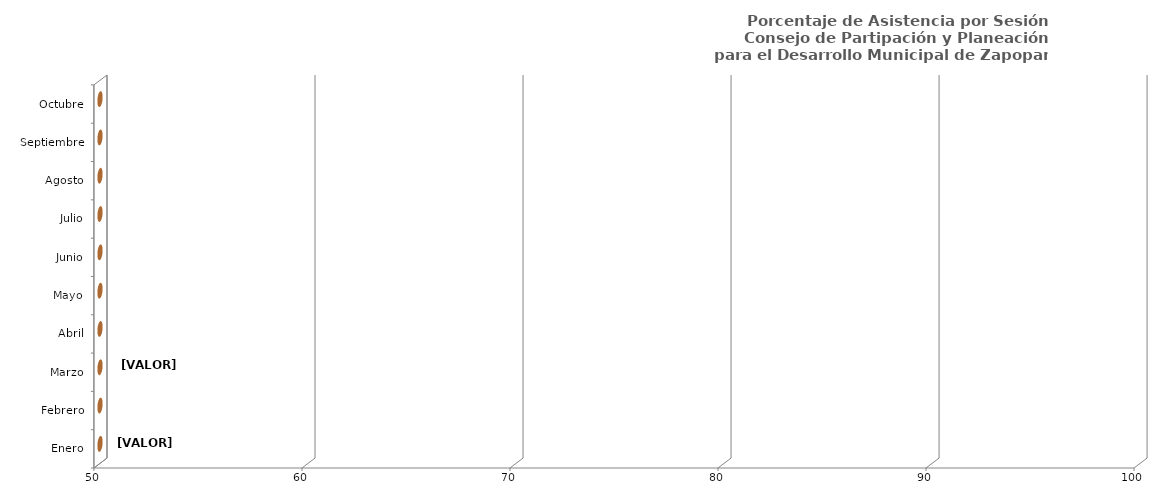
| Category | Series 0 |
|---|---|
| Enero | 0 |
| Febrero | 0 |
| Marzo | 0 |
| Abril | 0 |
| Mayo | 0 |
| Junio | 0 |
| Julio | 0 |
| Agosto | 0 |
| Septiembre | 0 |
| Octubre | 0 |